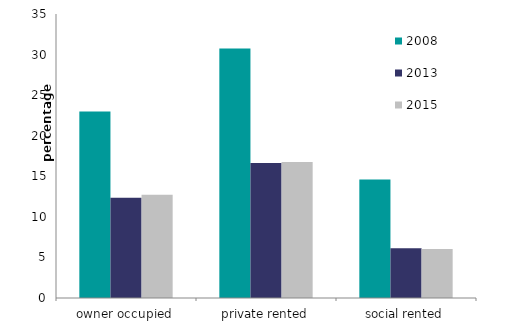
| Category | 2008 | 2013 | 2015 |
|---|---|---|---|
| owner occupied | 22.999 | 12.35 | 12.738 |
| private rented | 30.735 | 16.639 | 16.754 |
| social rented | 14.595 | 6.126 | 6.034 |